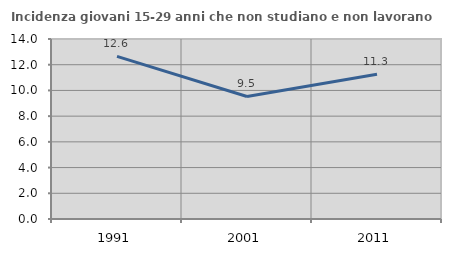
| Category | Incidenza giovani 15-29 anni che non studiano e non lavorano  |
|---|---|
| 1991.0 | 12.647 |
| 2001.0 | 9.528 |
| 2011.0 | 11.263 |